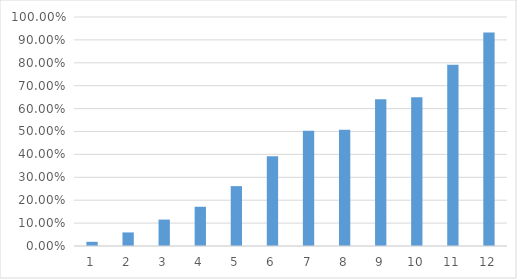
| Category | Series 0 |
|---|---|
| 0 | 0.018 |
| 1 | 0.059 |
| 2 | 0.115 |
| 3 | 0.171 |
| 4 | 0.262 |
| 5 | 0.392 |
| 6 | 0.503 |
| 7 | 0.508 |
| 8 | 0.64 |
| 9 | 0.65 |
| 10 | 0.791 |
| 11 | 0.933 |